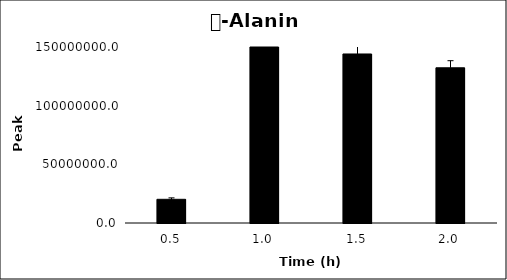
| Category | Series 0 |
|---|---|
| 0.5 | 20196610.667 |
| 1.0 | 150517921 |
| 1.5 | 144059622.333 |
| 2.0 | 132277207.333 |